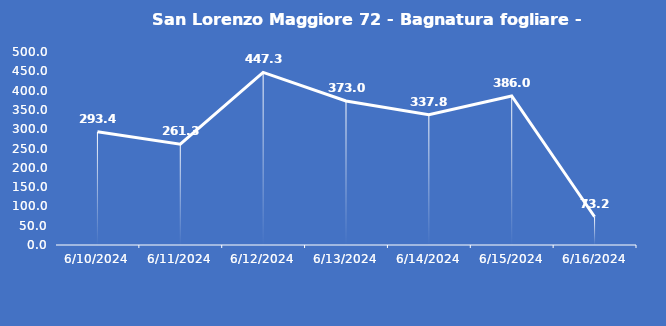
| Category | San Lorenzo Maggiore 72 - Bagnatura fogliare - Grezzo (min) |
|---|---|
| 6/10/24 | 293.4 |
| 6/11/24 | 261.3 |
| 6/12/24 | 447.3 |
| 6/13/24 | 373 |
| 6/14/24 | 337.8 |
| 6/15/24 | 386 |
| 6/16/24 | 73.2 |